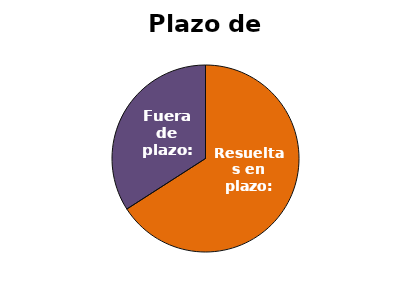
| Category | Series 0 |
|---|---|
| Resueltas en plazo: | 29 |
| Fuera de plazo: | 15 |